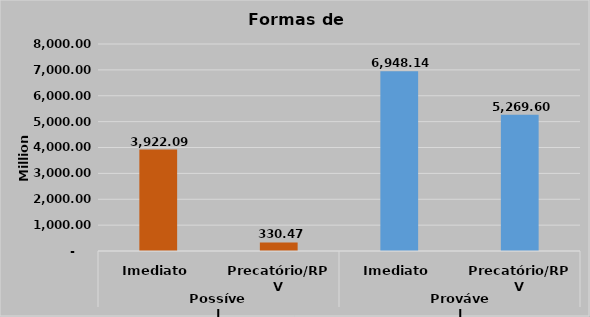
| Category | Series 0 |
|---|---|
| 0 | 3922092558.87 |
| 1 | 330473758.45 |
| 2 | 6948141034.31 |
| 3 | 5269601269.96 |